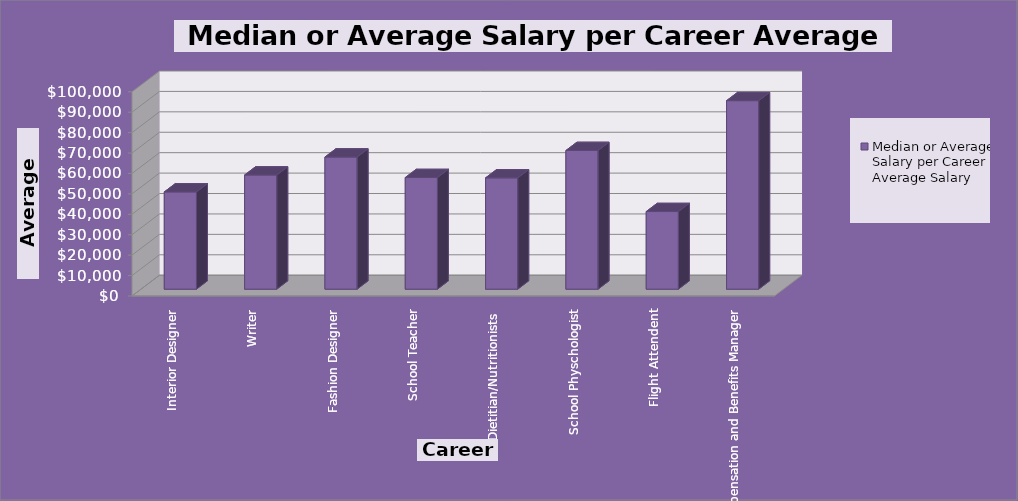
| Category | Median or Average Salary per Career Average Salary |
|---|---|
| Interior Designer | 47620 |
| Writer | 55900 |
| Fashion Designer | 64700 |
| School Teacher | 54655 |
| Dietitian/Nutritionists  | 54500 |
| School Physchologist | 67900 |
| Flight Attendent | 38000 |
| Compensation and Benefits Manager | 92300 |